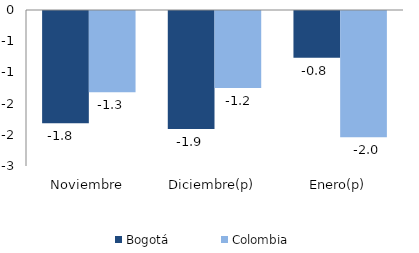
| Category | Bogotá | Colombia |
|---|---|---|
| Noviembre | -1.8 | -1.303 |
| Diciembre(p) | -1.89 | -1.233 |
| Enero(p) | -0.75 | -2.023 |